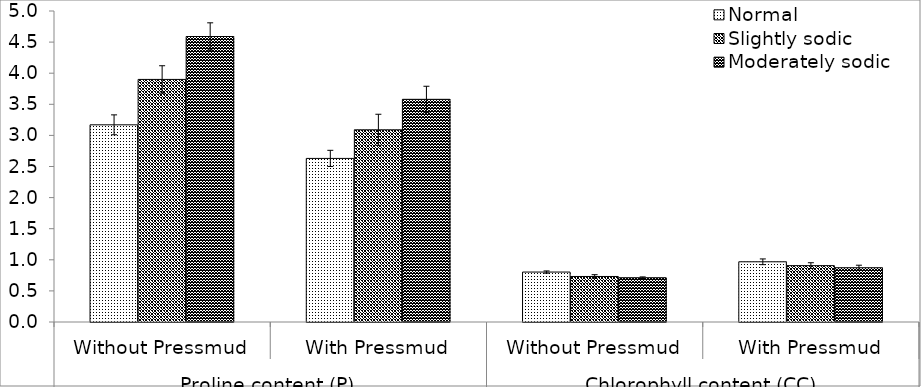
| Category | Normal | Slightly sodic | Moderately sodic |
|---|---|---|---|
| 0 | 3.17 | 3.9 | 4.59 |
| 1 | 2.63 | 3.09 | 3.58 |
| 2 | 0.803 | 0.732 | 0.712 |
| 3 | 0.968 | 0.906 | 0.872 |